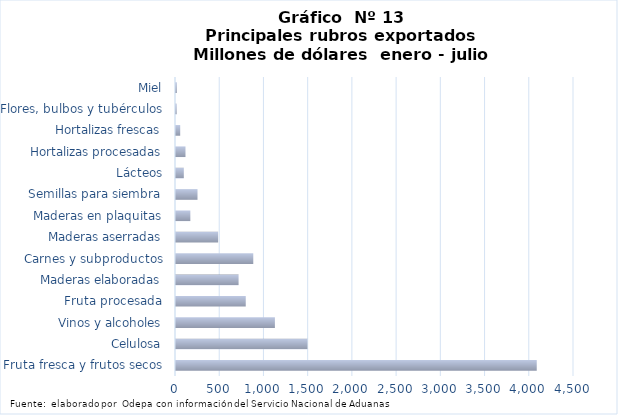
| Category | Series 7 |
|---|---|
| Fruta fresca y frutos secos | 4078807.068 |
| Celulosa | 1486161.455 |
| Vinos y alcoholes | 1118175.328 |
| Fruta procesada | 788629.963 |
| Maderas elaboradas | 707594.825 |
| Carnes y subproductos | 873696.769 |
| Maderas aserradas | 476482.301 |
| Maderas en plaquitas | 162134.268 |
| Semillas para siembra | 243200.779 |
| Lácteos | 88360.114 |
| Hortalizas procesadas | 107237.773 |
| Hortalizas frescas | 47545.72 |
| Flores, bulbos y tubérculos | 7797.086 |
| Miel | 9384.301 |